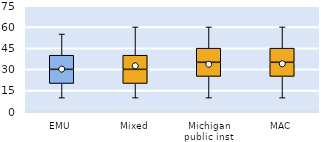
| Category | 25th | 50th | 75th |
|---|---|---|---|
| EMU | 20 | 10 | 10 |
| Mixed | 20 | 10 | 10 |
| Michigan public inst | 25 | 10 | 10 |
| MAC | 25 | 10 | 10 |